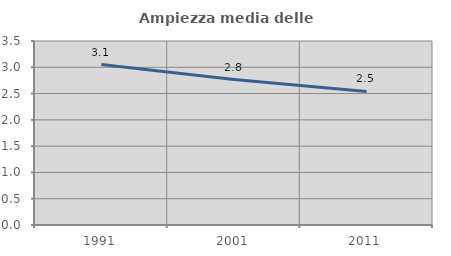
| Category | Ampiezza media delle famiglie |
|---|---|
| 1991.0 | 3.052 |
| 2001.0 | 2.768 |
| 2011.0 | 2.541 |